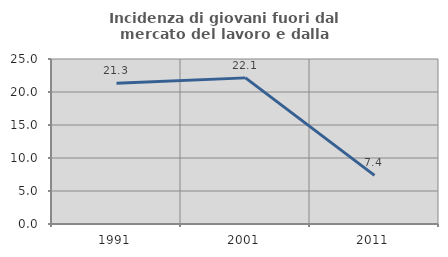
| Category | Incidenza di giovani fuori dal mercato del lavoro e dalla formazione  |
|---|---|
| 1991.0 | 21.32 |
| 2001.0 | 22.14 |
| 2011.0 | 7.359 |